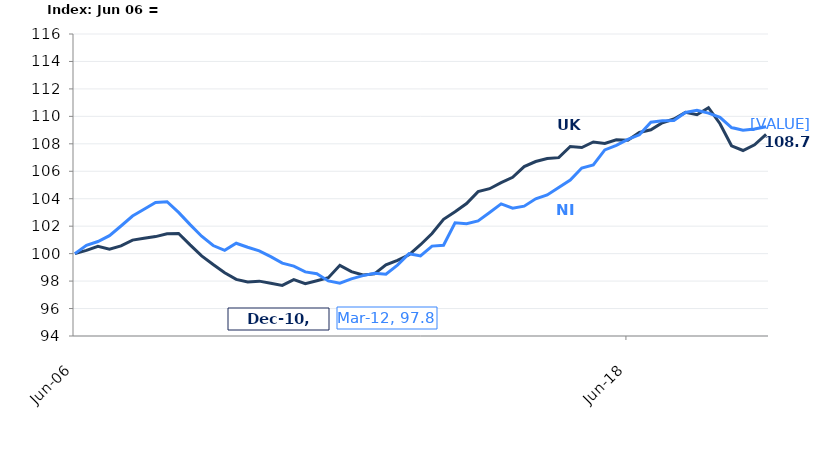
| Category | UK |
|---|---|
| 2006-06-01 | 100 |
| 2006-09-01 | 100.236 |
| 2006-12-01 | 100.529 |
| 2007-03-01 | 100.329 |
| 2007-06-01 | 100.569 |
| 2007-09-01 | 100.987 |
| 2007-12-01 | 101.123 |
| 2008-03-01 | 101.241 |
| 2008-06-01 | 101.445 |
| 2008-09-01 | 101.474 |
| 2008-12-01 | 100.637 |
| 2009-03-01 | 99.839 |
| 2009-06-01 | 99.209 |
| 2009-09-01 | 98.612 |
| 2009-12-01 | 98.122 |
| 2010-03-01 | 97.929 |
| 2010-06-01 | 97.997 |
| 2010-09-01 | 97.843 |
| 2010-12-01 | 97.689 |
| 2011-03-01 | 98.108 |
| 2011-06-01 | 97.818 |
| 2011-09-01 | 98.022 |
| 2011-12-01 | 98.243 |
| 2012-03-01 | 99.149 |
| 2012-06-01 | 98.691 |
| 2012-09-01 | 98.44 |
| 2012-12-01 | 98.526 |
| 2013-03-01 | 99.184 |
| 2013-06-01 | 99.513 |
| 2013-09-01 | 99.918 |
| 2013-12-01 | 100.648 |
| 2014-03-01 | 101.463 |
| 2014-06-01 | 102.497 |
| 2014-09-01 | 103.048 |
| 2014-12-01 | 103.645 |
| 2015-03-01 | 104.518 |
| 2015-06-01 | 104.729 |
| 2015-09-01 | 105.177 |
| 2015-12-01 | 105.559 |
| 2016-03-01 | 106.343 |
| 2016-06-01 | 106.711 |
| 2016-09-01 | 106.933 |
| 2016-12-01 | 106.994 |
| 2017-03-01 | 107.806 |
| 2017-06-01 | 107.731 |
| 2017-09-01 | 108.135 |
| 2017-12-01 | 108.028 |
| 2018-03-01 | 108.296 |
| 2018-06-01 | 108.267 |
| 2018-09-01 | 108.829 |
| 2018-12-01 | 109.026 |
| 2019-03-01 | 109.537 |
| 2019-06-01 | 109.806 |
| 2019-09-01 | 110.289 |
| 2019-12-01 | 110.117 |
| 2020-03-01 | 110.629 |
| 2020-06-01 | 109.466 |
| 2020-09-01 | 107.856 |
| 2020-12-01 | 107.513 |
| 2021-03-01 | 107.924 |
| 2021-06-01 | 108.69 |